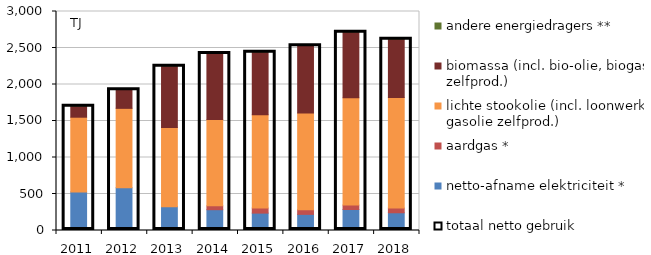
| Category | netto-afname elektriciteit * | aardgas * | lichte stookolie (incl. loonwerk, gasolie zelfprod.) | biomassa (incl. bio-olie, biogas zelfprod.) | andere energiedragers ** |
|---|---|---|---|---|---|
| 2011.0 | 528.703 | 0 | 1023.194 | 154.775 | 2.342 |
| 2012.0 | 585.863 | 0 | 1087.342 | 261.23 | 0.88 |
| 2013.0 | 327.016 | 0 | 1083.066 | 845.443 | 0.734 |
| 2014.0 | 284.941 | 52.638 | 1183.321 | 911.578 | 0.638 |
| 2015.0 | 238.078 | 69.361 | 1278.272 | 861.805 | 1.527 |
| 2016.0 | 220.939 | 65.003 | 1322.883 | 926.592 | 2.005 |
| 2017.0 | 287.385 | 60.981 | 1471.176 | 902.804 | 1.455 |
| 2018.0 | 242.787 | 64.176 | 1515.341 | 802.898 | 1.896 |